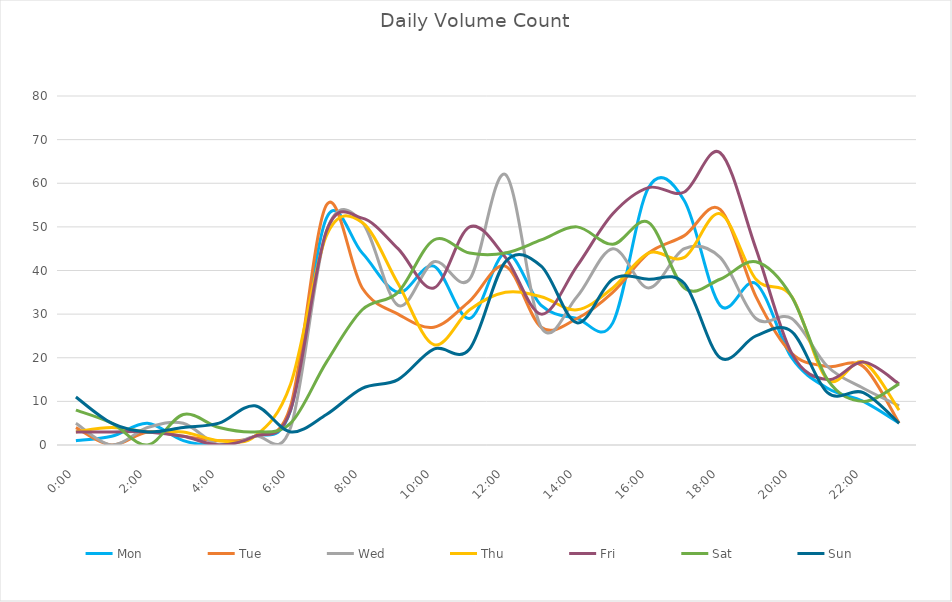
| Category | Mon | Tue | Wed | Thu | Fri | Sat | Sun |
|---|---|---|---|---|---|---|---|
| 0.0 | 1 | 4 | 5 | 3 | 3 | 8 | 11 |
| 0.0416666666666667 | 2 | 0 | 0 | 4 | 3 | 5 | 5 |
| 0.0833333333333333 | 5 | 3 | 4 | 3 | 3 | 0 | 3 |
| 0.125 | 1 | 2 | 5 | 3 | 2 | 7 | 4 |
| 0.166666666666667 | 0 | 1 | 0 | 1 | 0 | 4 | 5 |
| 0.208333333333333 | 2 | 2 | 2 | 2 | 2 | 3 | 9 |
| 0.25 | 8 | 9 | 4 | 14 | 8 | 5 | 3 |
| 0.291666666666667 | 52 | 55 | 49 | 48 | 49 | 19 | 7 |
| 0.333333333333333 | 44 | 36 | 51 | 51 | 52 | 31 | 13 |
| 0.375 | 35 | 30 | 32 | 37 | 45 | 35 | 15 |
| 0.416666666666667 | 41 | 27 | 42 | 23 | 36 | 47 | 22 |
| 0.4583333333333333 | 29 | 33 | 38 | 31 | 50 | 44 | 22 |
| 0.5 | 44 | 41 | 62 | 35 | 43 | 44 | 42 |
| 0.541666666666667 | 32 | 27 | 27 | 34 | 30 | 47 | 41 |
| 0.5833333333333334 | 29 | 29 | 34 | 31 | 41 | 50 | 28 |
| 0.625 | 28 | 35 | 45 | 36 | 53 | 46 | 38 |
| 0.666666666666667 | 59 | 44 | 36 | 44 | 59 | 51 | 38 |
| 0.7083333333333334 | 56 | 48 | 45 | 43 | 58 | 36 | 37 |
| 0.75 | 32 | 54 | 43 | 53 | 67 | 38 | 20 |
| 0.791666666666667 | 37 | 34 | 29 | 38 | 45 | 42 | 25 |
| 0.8333333333333334 | 20 | 21 | 29 | 34 | 21 | 34 | 26 |
| 0.875 | 13 | 18 | 18 | 15 | 15 | 15 | 12 |
| 0.916666666666667 | 10 | 18 | 13 | 19 | 19 | 10 | 12 |
| 0.9583333333333334 | 5 | 5 | 9 | 8 | 14 | 14 | 5 |